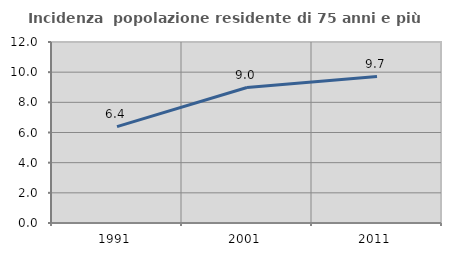
| Category | Incidenza  popolazione residente di 75 anni e più |
|---|---|
| 1991.0 | 6.386 |
| 2001.0 | 8.982 |
| 2011.0 | 9.71 |